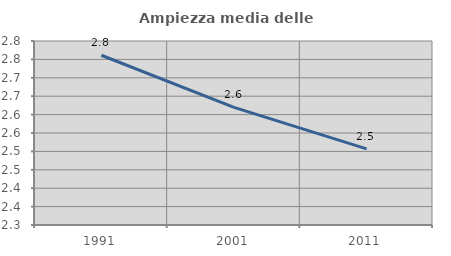
| Category | Ampiezza media delle famiglie |
|---|---|
| 1991.0 | 2.761 |
| 2001.0 | 2.62 |
| 2011.0 | 2.507 |